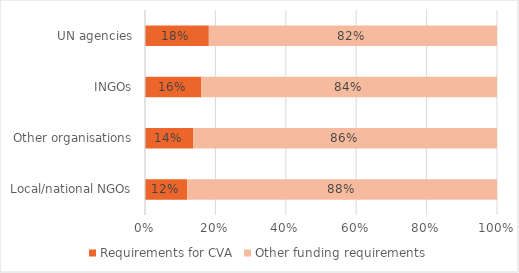
| Category | Requirements for CVA | Other funding requirements |
|---|---|---|
| Local/national NGOs | 0.12 | 0.88 |
| Other organisations | 0.136 | 0.864 |
| INGOs | 0.16 | 0.84 |
| UN agencies | 0.181 | 0.819 |